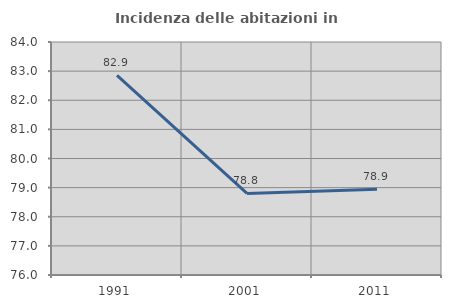
| Category | Incidenza delle abitazioni in proprietà  |
|---|---|
| 1991.0 | 82.857 |
| 2001.0 | 78.802 |
| 2011.0 | 78.947 |